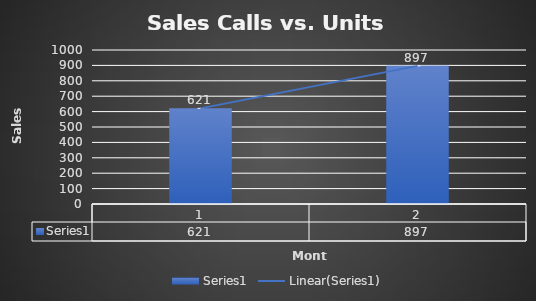
| Category | Series 0 |
|---|---|
| 0 | 621 |
| 1 | 897 |